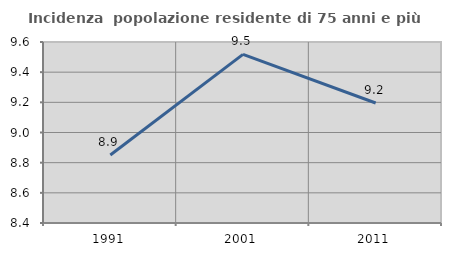
| Category | Incidenza  popolazione residente di 75 anni e più |
|---|---|
| 1991.0 | 8.851 |
| 2001.0 | 9.518 |
| 2011.0 | 9.195 |